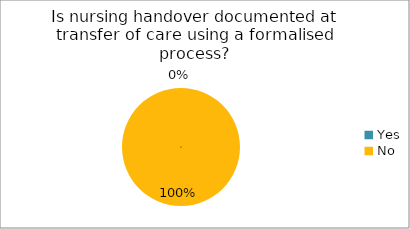
| Category | Is nursing handover documented at transfer of care using a formalised process? |
|---|---|
| Yes | 0 |
| No | 1 |